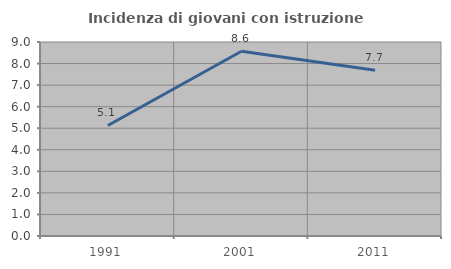
| Category | Incidenza di giovani con istruzione universitaria |
|---|---|
| 1991.0 | 5.128 |
| 2001.0 | 8.571 |
| 2011.0 | 7.692 |